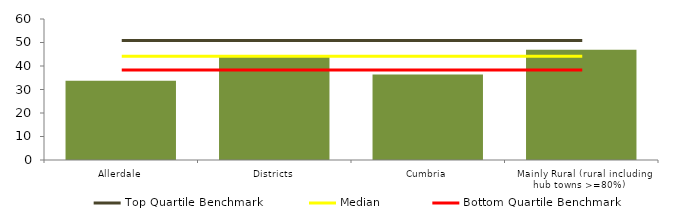
| Category | Block Data |
|---|---|
| Allerdale | 33.7 |
| Districts | 44.177 |
| Cumbria | 36.383 |
|  Mainly Rural (rural including hub towns >=80%)   | 46.95 |